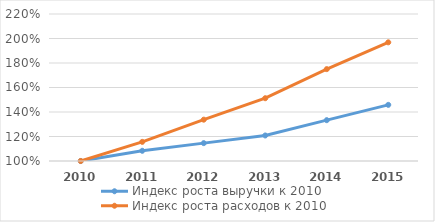
| Category | Индекс роста выручки к 2010 | Индекс роста расходов к 2010 |
|---|---|---|
| 2010.0 | 1 | 1 |
| 2011.0 | 1.083 | 1.156 |
| 2012.0 | 1.146 | 1.338 |
| 2013.0 | 1.208 | 1.512 |
| 2014.0 | 1.333 | 1.75 |
| 2015.0 | 1.458 | 1.969 |